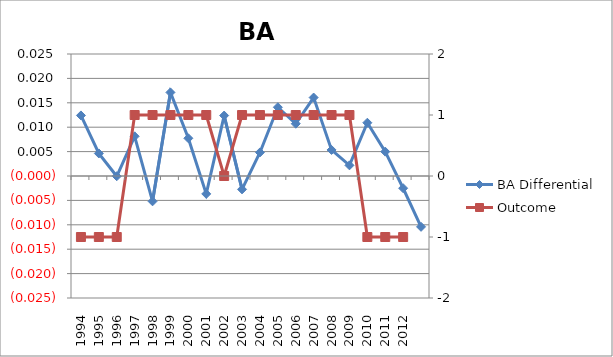
| Category | BA Differential |
|---|---|
| 1994.0 | 0.012 |
| 1995.0 | 0.005 |
| 1996.0 | 0 |
| 1997.0 | 0.008 |
| 1998.0 | -0.005 |
| 1999.0 | 0.017 |
| 2000.0 | 0.008 |
| 2001.0 | -0.004 |
| 2002.0 | 0.012 |
| 2003.0 | -0.003 |
| 2004.0 | 0.005 |
| 2005.0 | 0.014 |
| 2006.0 | 0.011 |
| 2007.0 | 0.016 |
| 2008.0 | 0.005 |
| 2009.0 | 0.002 |
| 2010.0 | 0.011 |
| 2011.0 | 0.005 |
| 2012.0 | -0.003 |